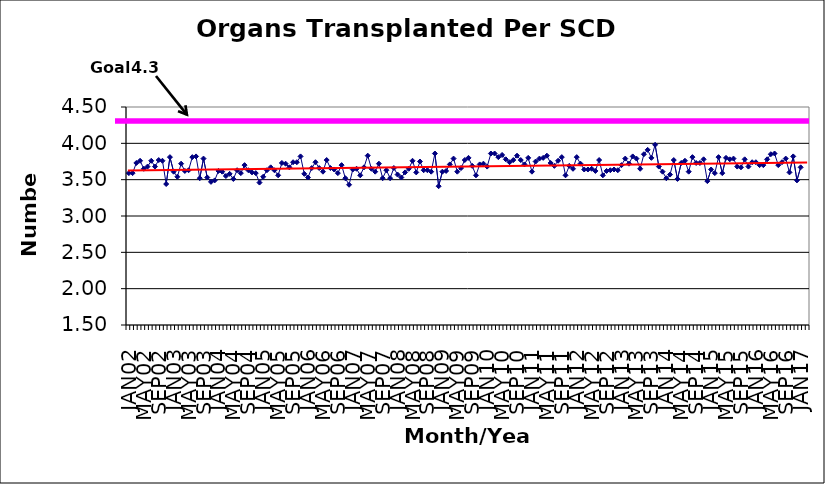
| Category | Series 0 |
|---|---|
| JAN02 | 3.59 |
| FEB02 | 3.59 |
| MAR02 | 3.73 |
| APR02 | 3.76 |
| MAY02 | 3.65 |
| JUN02 | 3.68 |
| JUL02 | 3.76 |
| AUG02 | 3.68 |
| SEP02 | 3.77 |
| OCT02 | 3.76 |
| NOV02 | 3.44 |
| DEC02 | 3.81 |
| JAN03 | 3.61 |
| FEB03 | 3.54 |
| MAR03 | 3.72 |
| APR03 | 3.62 |
| MAY03 | 3.63 |
| JUN03 | 3.81 |
| JUL03 | 3.82 |
| AUG03 | 3.52 |
| SEP03 | 3.79 |
| OCT03 | 3.53 |
| NOV03 | 3.47 |
| DEC03 | 3.49 |
| JAN04 | 3.62 |
| FEB04 | 3.61 |
| MAR04 | 3.55 |
| APR04 | 3.58 |
| MAY04 | 3.51 |
| JUN04 | 3.63 |
| JUL04 | 3.59 |
| AUG04 | 3.7 |
| SEP04 | 3.63 |
| OCT04 | 3.6 |
| NOV04 | 3.59 |
| DEC04 | 3.46 |
| JAN05 | 3.54 |
| FEB05 | 3.63 |
| MAR05 | 3.67 |
| APR05 | 3.63 |
| MAY05 | 3.56 |
| JUN05 | 3.73 |
| JUL05 | 3.72 |
| AUG05 | 3.67 |
| SEP05 | 3.74 |
| OCT05 | 3.74 |
| NOV05 | 3.82 |
| DEC05 | 3.58 |
| JAN06 | 3.53 |
| FEB06 | 3.66 |
| MAR06 | 3.74 |
| APR06 | 3.66 |
| MAY06 | 3.61 |
| JUN06 | 3.77 |
| JUL06 | 3.66 |
| AUG06 | 3.64 |
| SEP06 | 3.59 |
| OCT06 | 3.7 |
| NOV06 | 3.52 |
| DEC06 | 3.43 |
| JAN07 | 3.64 |
| FEB07 | 3.65 |
| MAR07 | 3.56 |
| APR07 | 3.67 |
| MAY07 | 3.83 |
| JUN07 | 3.65 |
| JUL07 | 3.61 |
| AUG07 | 3.72 |
| SEP07 | 3.52 |
| OCT07 | 3.63 |
| NOV07 | 3.52 |
| DEC07 | 3.66 |
| JAN08 | 3.57 |
| FEB08 | 3.53 |
| MAR08 | 3.6 |
| APR08 | 3.65 |
| MAY08 | 3.76 |
| JUN08 | 3.6 |
| JUL08 | 3.75 |
| AUG08 | 3.63 |
| SEP08 | 3.63 |
| OCT08 | 3.61 |
| NOV08 | 3.86 |
| DEC08 | 3.41 |
| JAN09 | 3.61 |
| FEB09 | 3.62 |
| MAR09 | 3.71 |
| APR09 | 3.79 |
| MAY09 | 3.61 |
| JUN09 | 3.66 |
| JUL09 | 3.77 |
| AUG09 | 3.8 |
| SEP09 | 3.69 |
| OCT09 | 3.56 |
| NOV09 | 3.71 |
| DEC09 | 3.72 |
| JAN10 | 3.68 |
| FEB10 | 3.86 |
| MAR10 | 3.86 |
| APR10 | 3.81 |
| MAY10 | 3.84 |
| JUN10 | 3.78 |
| JUL10 | 3.74 |
| AUG10 | 3.77 |
| SEP10 | 3.83 |
| OCT10 | 3.77 |
| NOV10 | 3.71 |
| DEC10 | 3.8 |
| JAN11 | 3.61 |
| FEB11 | 3.75 |
| MAR11 | 3.79 |
| APR11 | 3.8 |
| MAY11 | 3.83 |
| JUN11 | 3.73 |
| JUL11 | 3.69 |
| AUG11 | 3.76 |
| SEP11 | 3.81 |
| OCT11 | 3.56 |
| NOV11 | 3.69 |
| DEC11 | 3.65 |
| JAN12 | 3.81 |
| FEB12 | 3.72 |
| MAR12 | 3.64 |
| APR12 | 3.64 |
| MAY12 | 3.65 |
| JUN12 | 3.62 |
| JUL12 | 3.77 |
| AUG12 | 3.56 |
| SEP12 | 3.62 |
| OCT12 | 3.63 |
| NOV12 | 3.64 |
| DEC12 | 3.63 |
| JAN13 | 3.7 |
| FEB13 | 3.79 |
| MAR13 | 3.72 |
| APR13 | 3.82 |
| MAY13 | 3.79 |
| JUN13 | 3.65 |
| JUL13 | 3.85 |
| AUG13 | 3.91 |
| SEP13 | 3.8 |
| OCT13 | 3.98 |
| NOV13 | 3.68 |
| DEC13 | 3.61 |
| JAN14 | 3.52 |
| FEB14 | 3.57 |
| MAR14 | 3.77 |
| APR14 | 3.51 |
| MAY14 | 3.73 |
| JUN14 | 3.76 |
| JUL14 | 3.61 |
| AUG14 | 3.81 |
| SEP14 | 3.73 |
| OCT14 | 3.73 |
| NOV14 | 3.78 |
| DEC14 | 3.48 |
| JAN15 | 3.64 |
| FEB15 | 3.59 |
| MAR15 | 3.81 |
| APR15 | 3.59 |
| MAY15 | 3.8 |
| JUN15 | 3.78 |
| JUL15 | 3.79 |
| AUG15 | 3.68 |
| SEP15 | 3.67 |
| OCT15 | 3.78 |
| NOV15 | 3.68 |
| DEC15 | 3.74 |
| JAN16 | 3.74 |
| FEB16 | 3.7 |
| MAR16 | 3.7 |
| APR16 | 3.78 |
| MAY16 | 3.85 |
| JUN16 | 3.86 |
| JUL16 | 3.7 |
| AUG16 | 3.74 |
| SEP16 | 3.79 |
| OCT16 | 3.6 |
| NOV16 | 3.82 |
| DEC16 | 3.49 |
| JAN17 | 3.67 |